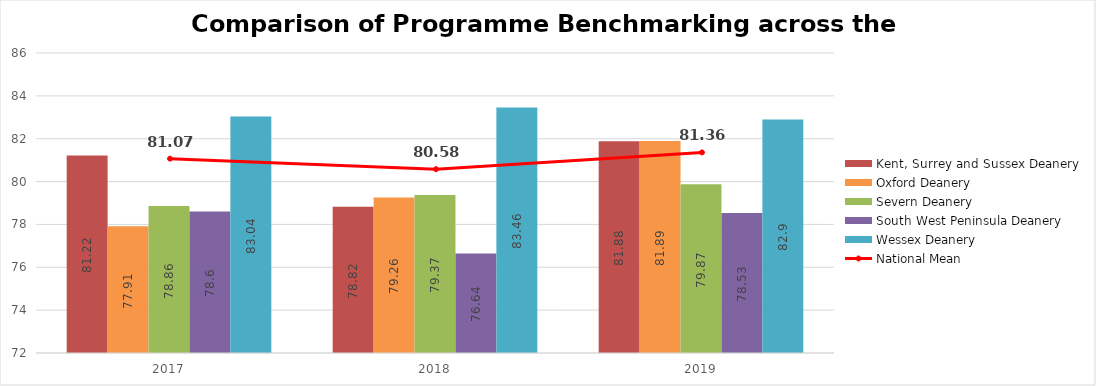
| Category | Kent, Surrey and Sussex Deanery | Oxford Deanery | Severn Deanery | South West Peninsula Deanery | Wessex Deanery |
|---|---|---|---|---|---|
| 2017 | 81.22 | 77.91 | 78.86 | 78.6 | 83.04 |
| 2018 | 78.82 | 79.26 | 79.37 | 76.64 | 83.46 |
| 2019 | 81.88 | 81.89 | 79.87 | 78.53 | 82.9 |